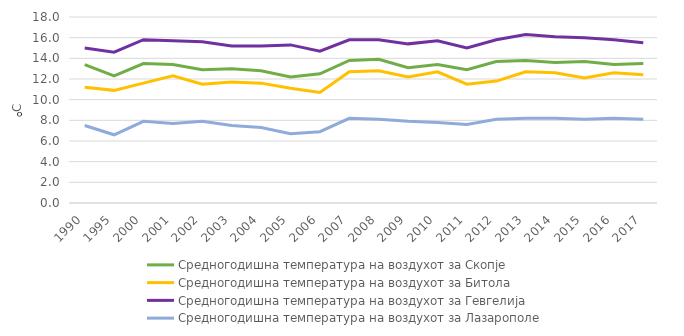
| Category | Средногодишна температура на воздухот за Скопје | Средногодишна температура на воздухот за Битола | Средногодишна температура на воздухот за Гевгелија | Средногодишна температура на воздухот за Лазарополе |
|---|---|---|---|---|
| 1990.0 | 13.4 | 11.2 | 15 | 7.5 |
| 1995.0 | 12.3 | 10.9 | 14.6 | 6.6 |
| 2000.0 | 13.5 | 11.6 | 15.8 | 7.9 |
| 2001.0 | 13.4 | 12.3 | 15.7 | 7.7 |
| 2002.0 | 12.9 | 11.5 | 15.6 | 7.9 |
| 2003.0 | 13 | 11.7 | 15.2 | 7.5 |
| 2004.0 | 12.8 | 11.6 | 15.2 | 7.3 |
| 2005.0 | 12.2 | 11.1 | 15.3 | 6.7 |
| 2006.0 | 12.5 | 10.7 | 14.7 | 6.9 |
| 2007.0 | 13.8 | 12.7 | 15.8 | 8.2 |
| 2008.0 | 13.9 | 12.8 | 15.8 | 8.1 |
| 2009.0 | 13.1 | 12.2 | 15.4 | 7.9 |
| 2010.0 | 13.4 | 12.7 | 15.7 | 7.8 |
| 2011.0 | 12.9 | 11.5 | 15 | 7.6 |
| 2012.0 | 13.7 | 11.8 | 15.8 | 8.1 |
| 2013.0 | 13.8 | 12.7 | 16.3 | 8.2 |
| 2014.0 | 13.6 | 12.6 | 16.1 | 8.2 |
| 2015.0 | 13.7 | 12.1 | 16 | 8.1 |
| 2016.0 | 13.4 | 12.6 | 15.8 | 8.2 |
| 2017.0 | 13.5 | 12.4 | 15.5 | 8.1 |